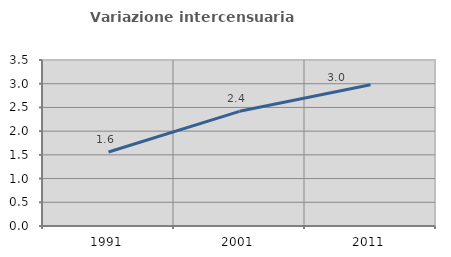
| Category | Variazione intercensuaria annua |
|---|---|
| 1991.0 | 1.56 |
| 2001.0 | 2.418 |
| 2011.0 | 2.98 |